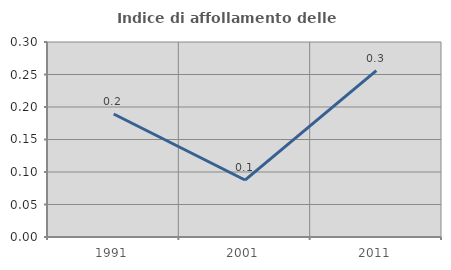
| Category | Indice di affollamento delle abitazioni  |
|---|---|
| 1991.0 | 0.189 |
| 2001.0 | 0.088 |
| 2011.0 | 0.256 |